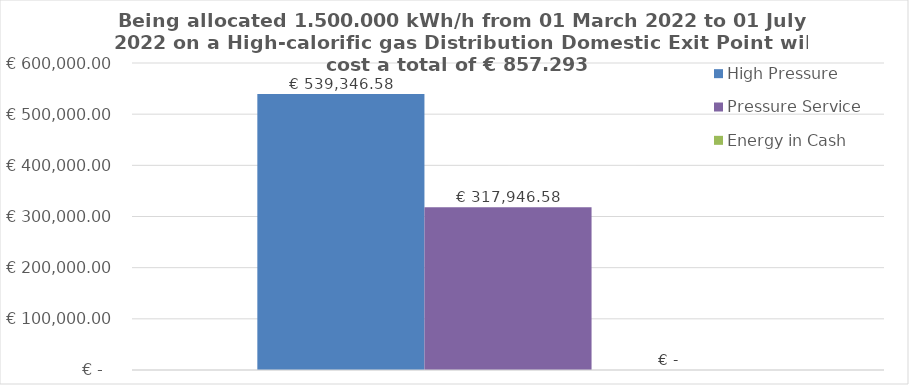
| Category | High Pressure | Pressure Service | Energy in Cash  |
|---|---|---|---|
|  | 539346.575 | 317946.575 | 0 |